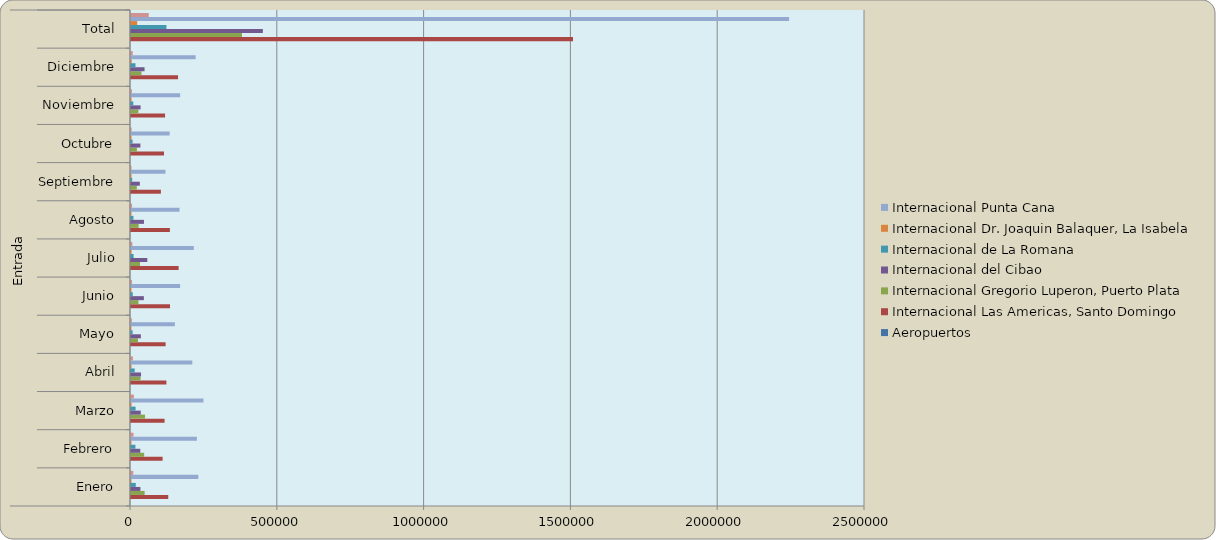
| Category | Aeropuertos | Internacional Las Americas, Santo Domingo | Internacional Gregorio Luperon, Puerto Plata  | Internacional del Cibao | Internacional de La Romana  | Internacional Dr. Joaquin Balaquer, La Isabela | Internacional Punta Cana  | Internacional Profesor Juan Bosch, El Catey (Samana) |
|---|---|---|---|---|---|---|---|---|
| 0 |  | 126891 | 46423 | 32036 | 16249 | 1518 | 229343 | 7795 |
| 1 |  | 107638 | 44767 | 31637 | 15100 | 1445 | 224286 | 8571 |
| 2 |  | 114337 | 47865 | 33224 | 15586 | 1919 | 246727 | 9757 |
| 3 |  | 120562 | 32578 | 34204 | 12625 | 1759 | 208837 | 6555 |
| 4 |  | 117939 | 23712 | 33553 | 5497 | 1594 | 149481 | 2996 |
| 5 |  | 132916 | 25311 | 43833 | 5972 | 1627 | 167216 | 3517 |
| 6 |  | 162196 | 30679 | 55467 | 8880 | 1923 | 213951 | 4664 |
| 7 |  | 132586 | 25966 | 44098 | 8291 | 1633 | 165169 | 3516 |
| 8 |  | 101782 | 19845 | 30094 | 4003 | 1671 | 117420 | 1808 |
| 9 |  | 112390 | 20116 | 32074 | 5378 | 1804 | 131645 | 2220 |
| 10 |  | 116045 | 25036 | 32683 | 7813 | 1783 | 167308 | 3159 |
| 11 |  | 160228 | 35656 | 46228 | 15278 | 2466 | 220142 | 5981 |
| 12 |  | 1505510 | 377954 | 449131 | 120672 | 21142 | 2241525 | 60539 |